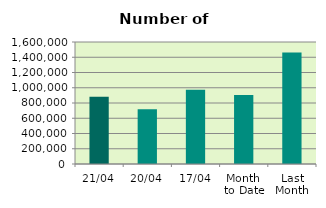
| Category | Series 0 |
|---|---|
| 21/04 | 880998 |
| 20/04 | 719506 |
| 17/04 | 972234 |
| Month 
to Date | 903715.077 |
| Last
Month | 1462822.818 |